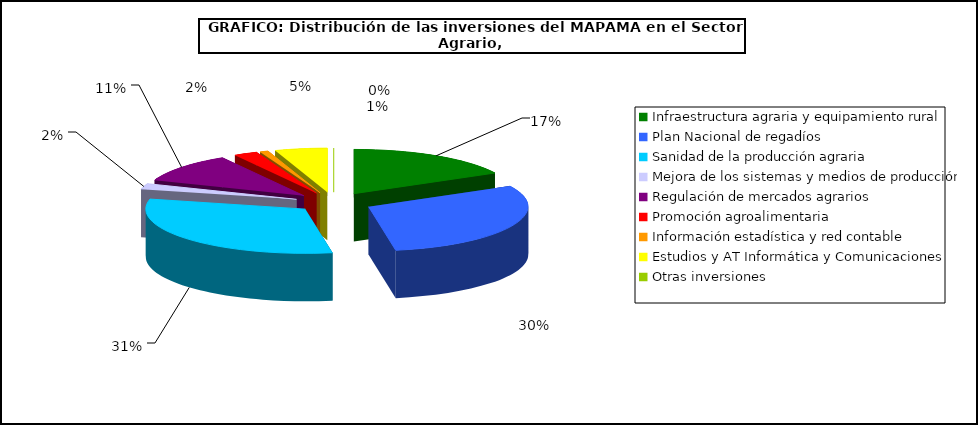
| Category | Series 0 |
|---|---|
| 0 | 17.263 |
| 1 | 30.022 |
| 2 | 31.371 |
| 3 | 2.101 |
| 4 | 10.712 |
| 5 | 2.399 |
| 6 | 0.835 |
| 7 | 5.297 |
| 8 | 0 |